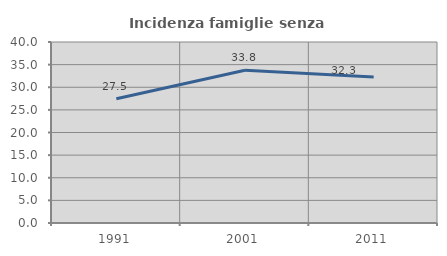
| Category | Incidenza famiglie senza nuclei |
|---|---|
| 1991.0 | 27.457 |
| 2001.0 | 33.777 |
| 2011.0 | 32.258 |